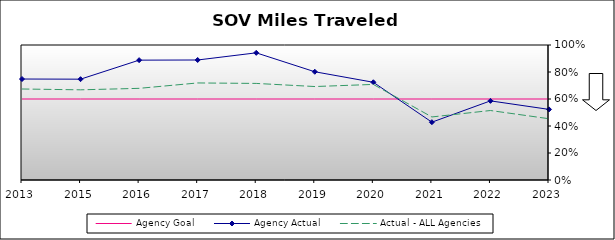
| Category | Agency Goal | Agency Actual | Actual - ALL Agencies |
|---|---|---|---|
| 2013.0 | 0.6 | 0.748 | 0.674 |
| 2015.0 | 0.6 | 0.747 | 0.668 |
| 2016.0 | 0.6 | 0.888 | 0.679 |
| 2017.0 | 0.6 | 0.889 | 0.719 |
| 2018.0 | 0.6 | 0.942 | 0.715 |
| 2019.0 | 0.6 | 0.802 | 0.692 |
| 2020.0 | 0.6 | 0.724 | 0.708 |
| 2021.0 | 0.6 | 0.428 | 0.467 |
| 2022.0 | 0.6 | 0.586 | 0.515 |
| 2023.0 | 0.6 | 0.523 | 0.454 |